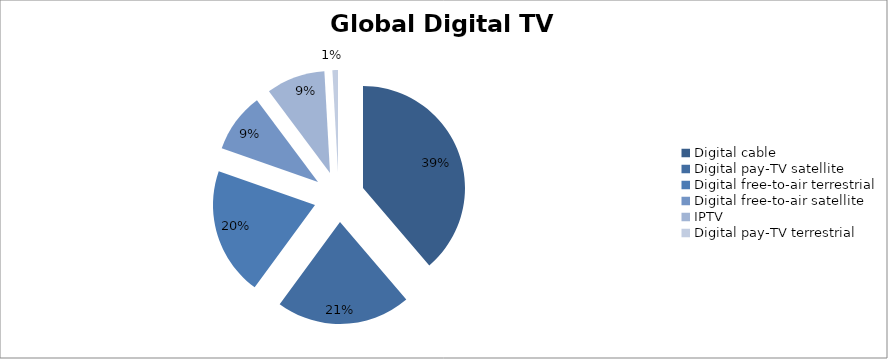
| Category | Series 0 |
|---|---|
| Digital cable | 0.387 |
| Digital pay-TV satellite | 0.213 |
| Digital free-to-air terrestrial | 0.203 |
| Digital free-to-air satellite | 0.094 |
| IPTV | 0.093 |
| Digital pay-TV terrestrial | 0.009 |